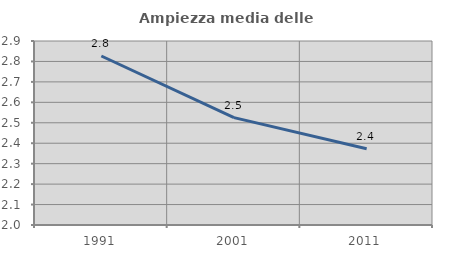
| Category | Ampiezza media delle famiglie |
|---|---|
| 1991.0 | 2.827 |
| 2001.0 | 2.525 |
| 2011.0 | 2.373 |